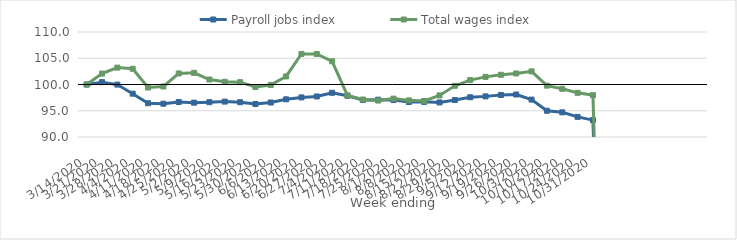
| Category | Payroll jobs index | Total wages index |
|---|---|---|
| 14/03/2020 | 100 | 100 |
| 21/03/2020 | 100.449 | 102.076 |
| 28/03/2020 | 99.984 | 103.218 |
| 04/04/2020 | 98.253 | 102.996 |
| 11/04/2020 | 96.429 | 99.422 |
| 18/04/2020 | 96.341 | 99.619 |
| 25/04/2020 | 96.665 | 102.103 |
| 02/05/2020 | 96.542 | 102.226 |
| 09/05/2020 | 96.632 | 100.948 |
| 16/05/2020 | 96.742 | 100.513 |
| 23/05/2020 | 96.627 | 100.446 |
| 30/05/2020 | 96.286 | 99.518 |
| 06/06/2020 | 96.571 | 99.917 |
| 13/06/2020 | 97.178 | 101.534 |
| 20/06/2020 | 97.542 | 105.821 |
| 27/06/2020 | 97.72 | 105.813 |
| 04/07/2020 | 98.421 | 104.422 |
| 11/07/2020 | 97.843 | 97.925 |
| 18/07/2020 | 97.039 | 97.142 |
| 25/07/2020 | 97.106 | 96.943 |
| 01/08/2020 | 97.036 | 97.309 |
| 08/08/2020 | 96.667 | 96.978 |
| 15/08/2020 | 96.696 | 96.855 |
| 22/08/2020 | 96.582 | 97.921 |
| 29/08/2020 | 97.034 | 99.756 |
| 05/09/2020 | 97.569 | 100.841 |
| 12/09/2020 | 97.737 | 101.452 |
| 19/09/2020 | 98.007 | 101.851 |
| 26/09/2020 | 98.092 | 102.103 |
| 03/10/2020 | 97.125 | 102.498 |
| 10/10/2020 | 94.998 | 99.78 |
| 17/10/2020 | 94.699 | 99.178 |
| 24/10/2020 | 93.836 | 98.414 |
| 31/10/2020 | 93.21 | 97.971 |